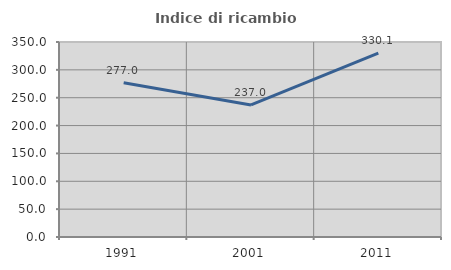
| Category | Indice di ricambio occupazionale  |
|---|---|
| 1991.0 | 276.978 |
| 2001.0 | 237.008 |
| 2011.0 | 330.075 |